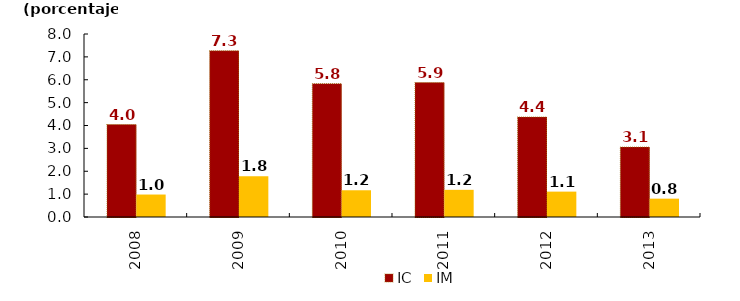
| Category | IC | IM |
|---|---|---|
| 2008.0 | 4.041 | 0.982 |
| 2009.0 | 7.266 | 1.781 |
| 2010.0 | 5.83 | 1.169 |
| 2011.0 | 5.875 | 1.188 |
| 2012.0 | 4.371 | 1.109 |
| 2013.0 | 3.056 | 0.802 |